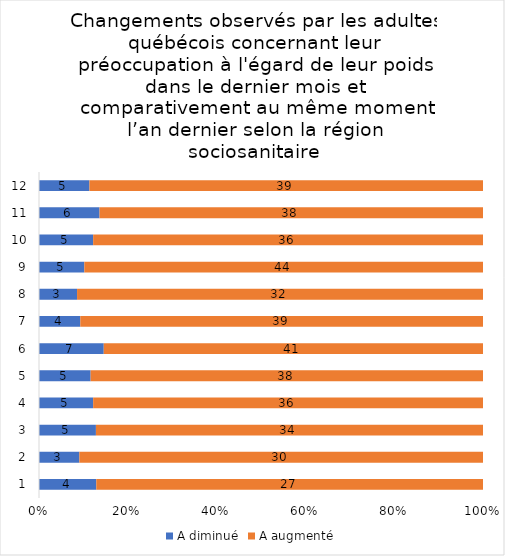
| Category | A diminué | A augmenté |
|---|---|---|
| 0 | 4 | 27 |
| 1 | 3 | 30 |
| 2 | 5 | 34 |
| 3 | 5 | 36 |
| 4 | 5 | 38 |
| 5 | 7 | 41 |
| 6 | 4 | 39 |
| 7 | 3 | 32 |
| 8 | 5 | 44 |
| 9 | 5 | 36 |
| 10 | 6 | 38 |
| 11 | 5 | 39 |